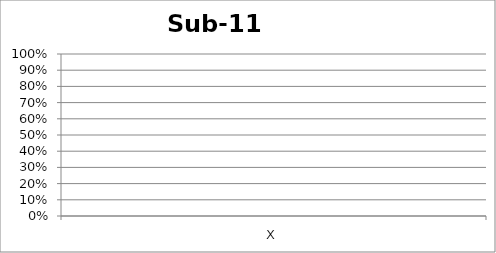
| Category | Sub-11 |
|---|---|
| X | 0 |